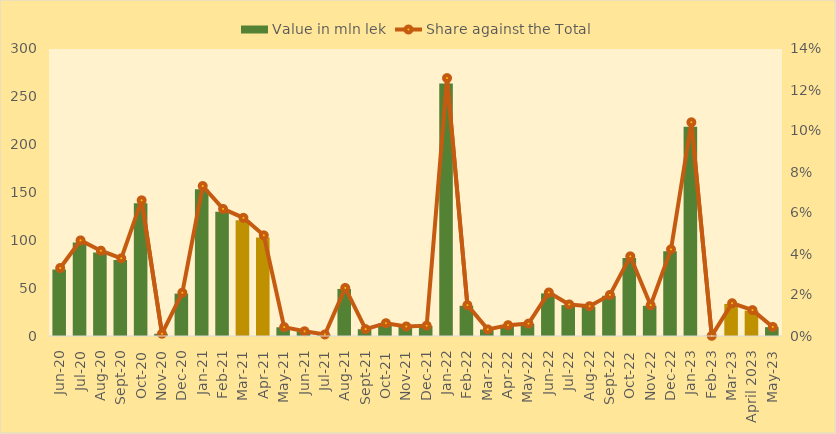
| Category | Value in mln lek |
|---|---|
| Jun-20 | 69.565 |
| Jul-20 | 97.817 |
| Aug-20 | 87.25 |
| Sep-20 | 79.468 |
| Oct-20 | 138.784 |
| Nov-20 | 2.339 |
| Dec-20 | 44.285 |
| Jan-21 | 153.425 |
| Feb-21 | 130 |
| Mar-21 | 120.891 |
| Apr-21 | 102.987 |
| May-21 | 9.12 |
| Jun-21 | 4.837 |
| Jul-21 | 1.571 |
| Aug-21 | 49.19 |
| Sep-21 | 7.057 |
| Oct-21 | 13.123 |
| Nov-21 | 9.731 |
| Dec-21 | 10.589 |
| Jan-22 | 263.844 |
| Feb-22 | 31.586 |
| Mar-22 | 6.779 |
| Apr-22 | 11.077 |
| May-22 | 12.683 |
| Jun-22 | 44.535 |
| Jul-22 | 32.276 |
| Aug-22 | 30.488 |
| Sep-22 | 42.062 |
| Oct-22 | 81.496 |
| Nov-22 | 31.562 |
| Dec-22 | 88.632 |
| Jan-23 | 218.625 |
| Feb-23 | 0.198 |
| Mar-23 | 33.525 |
| April 2023 | 26.501 |
| May-23 | 9.263 |